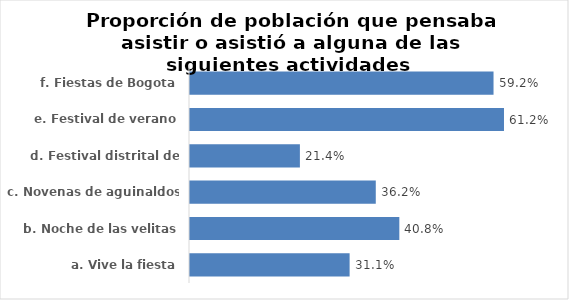
| Category | % Sí |
|---|---|
|  a. Vive la fiesta | 0.311 |
|  b. Noche de las velitas | 0.408 |
|  c. Novenas de aguinaldos | 0.362 |
|  d. Festival distrital de porras | 0.214 |
|  e. Festival de verano | 0.612 |
|  f. Fiestas de Bogota | 0.592 |